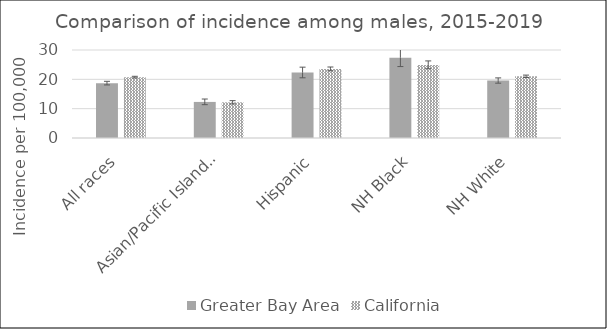
| Category | Greater Bay Area | California | SEER 18 |
|---|---|---|---|
| All races | 18.7 | 20.74 |  |
| Asian/Pacific Islander | 12.3 | 12.17 |  |
| Hispanic | 22.29 | 23.55 |  |
| NH Black | 27.39 | 24.92 |  |
| NH White | 19.57 | 21.03 |  |